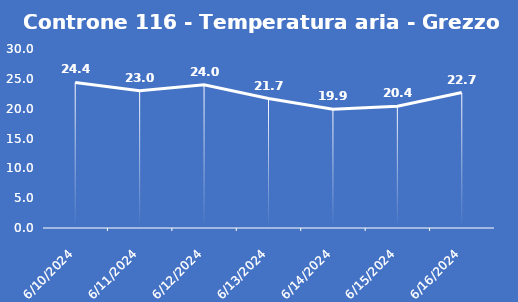
| Category | Controne 116 - Temperatura aria - Grezzo (°C) |
|---|---|
| 6/10/24 | 24.4 |
| 6/11/24 | 23 |
| 6/12/24 | 24 |
| 6/13/24 | 21.7 |
| 6/14/24 | 19.9 |
| 6/15/24 | 20.4 |
| 6/16/24 | 22.7 |